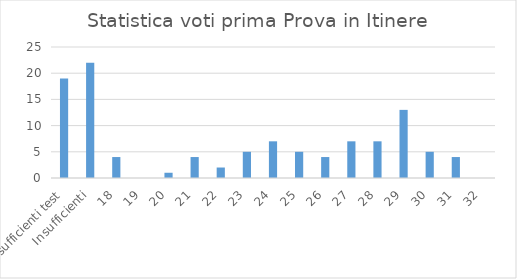
| Category | Series 0 |
|---|---|
| Insufficienti test | 19 |
| Insufficienti | 22 |
| 18 | 4 |
| 19 | 0 |
| 20 | 1 |
| 21 | 4 |
| 22 | 2 |
| 23 | 5 |
| 24 | 7 |
| 25 | 5 |
| 26 | 4 |
| 27 | 7 |
| 28 | 7 |
| 29 | 13 |
| 30 | 5 |
| 31 | 4 |
| 32 | 0 |